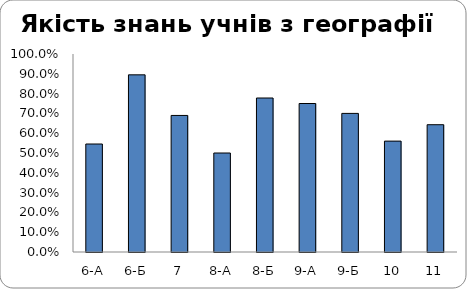
| Category | Series 0 |
|---|---|
| 6-А | 0.545 |
| 6-Б | 0.895 |
| 7 | 0.69 |
| 8-А | 0.5 |
| 8-Б | 0.778 |
| 9-А | 0.75 |
| 9-Б | 0.7 |
| 10 | 0.56 |
| 11 | 0.643 |